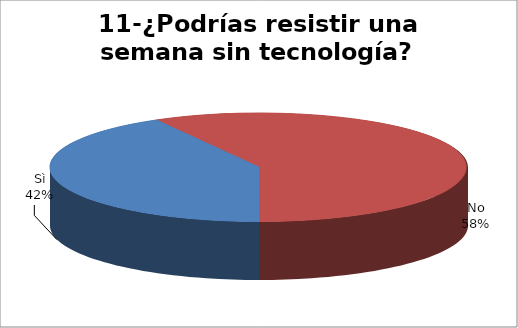
| Category | Series 0 |
|---|---|
| Sì | 138 |
| No | 192 |